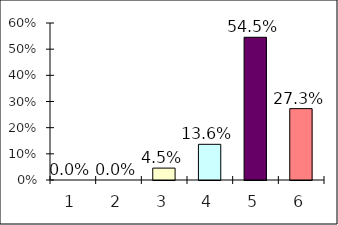
| Category | Series 0 |
|---|---|
| 0 | 0 |
| 1 | 0 |
| 2 | 0.045 |
| 3 | 0.136 |
| 4 | 0.545 |
| 5 | 0.273 |